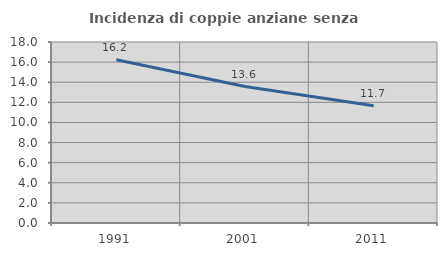
| Category | Incidenza di coppie anziane senza figli  |
|---|---|
| 1991.0 | 16.226 |
| 2001.0 | 13.571 |
| 2011.0 | 11.667 |